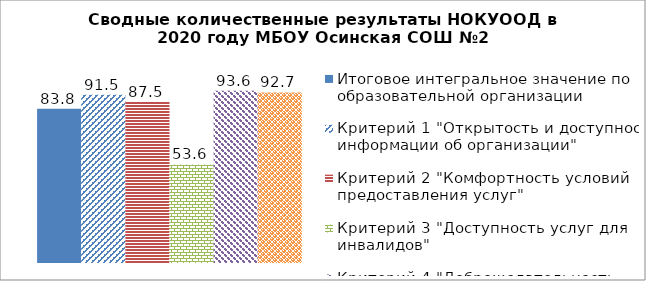
| Category | Итоговое интегральное значение по образовательной организации | Критерий 1 "Открытость и доступность информации об организации" | Критерий 2 "Комфортность условий предоставления услуг" | Критерий 3 "Доступность услуг для инвалидов" | Критерий 4 "Доброжелательность, вежливость работников" | Критерий 5 "Удовлетворенность условиями оказания услуг" |
|---|---|---|---|---|---|---|
| 0 | 83.8 | 91.5 | 87.5 | 53.6 | 93.6 | 92.7 |